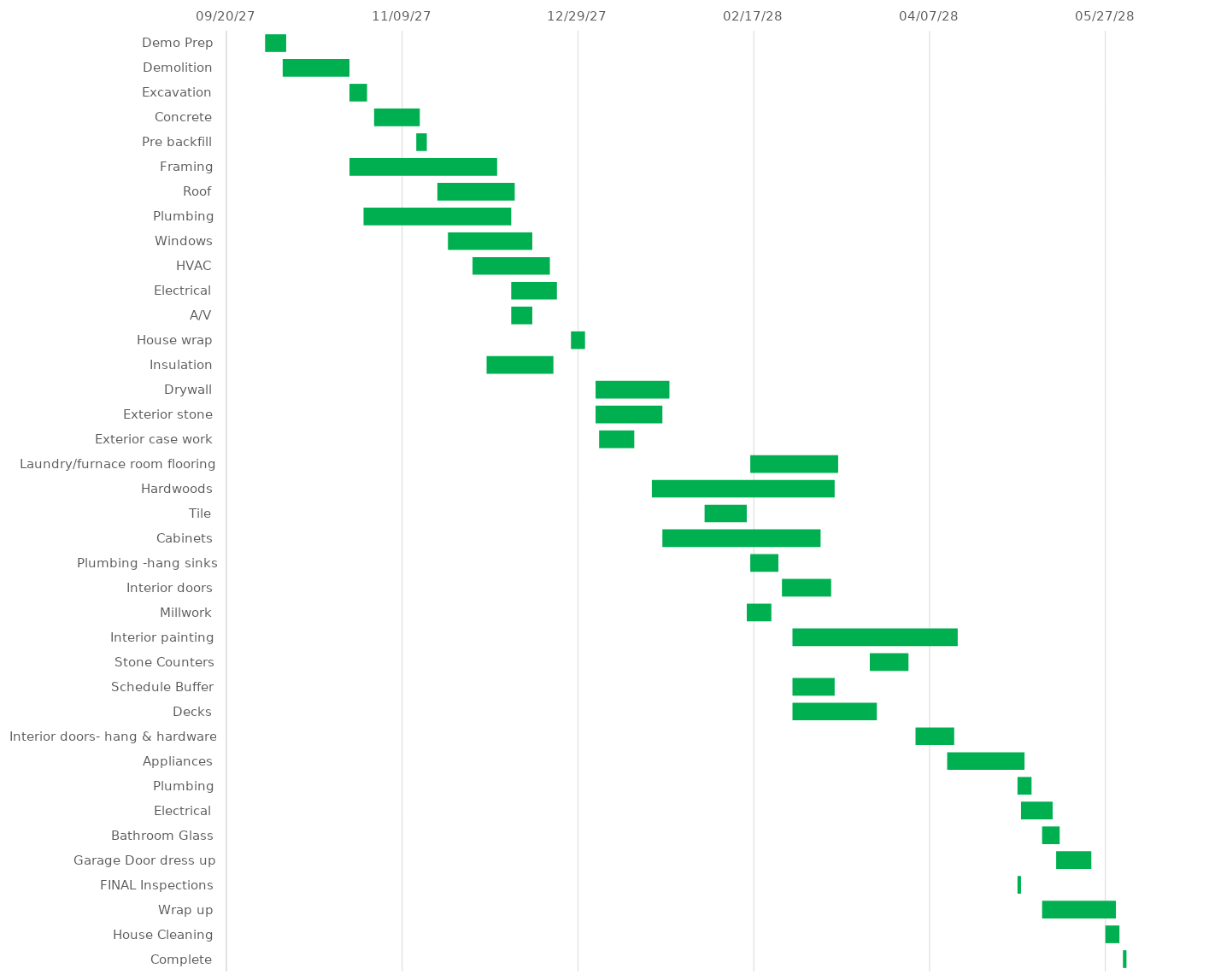
| Category | START 
DATE | Duration |
|---|---|---|
| Demo Prep | 2027-10-01 | 6 |
| Demolition | 2027-10-06 | 19 |
| Excavation | 2027-10-25 | 5 |
| Concrete | 2027-11-01 | 13 |
| Pre backfill | 2027-11-13 | 3 |
| Framing | 2027-10-25 | 42 |
| Roof | 2027-11-19 | 22 |
| Plumbing | 2027-10-29 | 42 |
| Windows | 2027-11-22 | 24 |
| HVAC | 2027-11-29 | 22 |
| Electrical | 2027-12-10 | 13 |
| A/V | 2027-12-10 | 6 |
| House wrap | 2027-12-27 | 4 |
| Insulation | 2027-12-03 | 19 |
| Drywall | 2028-01-03 | 21 |
| Exterior stone | 2028-01-03 | 19 |
| Exterior case work | 2028-01-04 | 10 |
| Laundry/furnace room flooring | 2028-02-16 | 25 |
| Hardwoods | 2028-01-19 | 52 |
| Tile | 2028-02-03 | 12 |
| Cabinets | 2028-01-22 | 45 |
| Plumbing -hang sinks | 2028-02-16 | 8 |
| Interior doors | 2028-02-25 | 14 |
| Millwork | 2028-02-15 | 7 |
| Interior painting | 2028-02-28 | 47 |
| Stone Counters | 2028-03-21 | 11 |
| Schedule Buffer | 2028-02-28 | 12 |
| Decks | 2028-02-28 | 24 |
| Interior doors- hang & hardware | 2028-04-03 | 11 |
| Appliances | 2028-04-12 | 22 |
| Plumbing | 2028-05-02 | 4 |
| Electrical | 2028-05-03 | 9 |
| Bathroom Glass | 2028-05-09 | 5 |
| Garage Door dress up | 2028-05-13 | 10 |
| FINAL Inspections | 2028-05-02 | 1 |
| Wrap up | 2028-05-09 | 21 |
| House Cleaning | 2028-05-27 | 4 |
| Complete | 2028-06-01 | 1 |